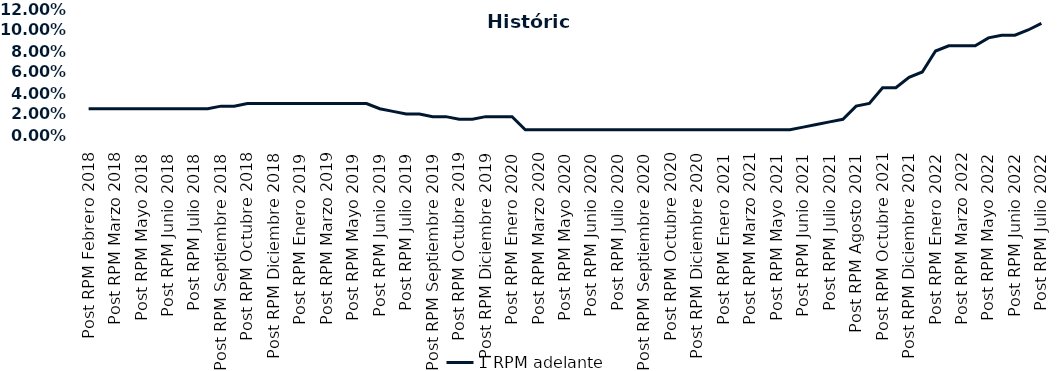
| Category | 1 RPM adelante |
|---|---|
| Post RPM Febrero 2018 | 0.025 |
| Pre RPM Marzo 2018 | 0.025 |
| Post RPM Marzo 2018 | 0.025 |
| Pre RPM Mayo 2018 | 0.025 |
| Post RPM Mayo 2018 | 0.025 |
| Pre RPM Junio 2018 | 0.025 |
| Post RPM Junio 2018 | 0.025 |
| Pre RPM Julio 2018 | 0.025 |
| Post RPM Julio 2018 | 0.025 |
| Pre RPM Septiembre 2018 | 0.025 |
| Post RPM Septiembre 2018 | 0.028 |
| Pre RPM Octubre 2018 | 0.028 |
| Post RPM Octubre 2018 | 0.03 |
| Pre RPM Diciembre 2018 | 0.03 |
| Post RPM Diciembre 2018 | 0.03 |
| Pre RPM Enero 2019 | 0.03 |
| Post RPM Enero 2019 | 0.03 |
| Pre RPM Marzo 2019 | 0.03 |
| Post RPM Marzo 2019 | 0.03 |
| Pre RPM Mayo 2019 | 0.03 |
| Post RPM Mayo 2019 | 0.03 |
| Pre RPM Junio 2019 | 0.03 |
| Post RPM Junio 2019 | 0.025 |
| Pre RPM Julio 2019 | 0.022 |
| Post RPM Julio 2019 | 0.02 |
| Pre RPM Septiembre 2019 | 0.02 |
| Post RPM Septiembre 2019 | 0.018 |
| Pre RPM Octubre 2019 | 0.018 |
| Post RPM Octubre 2019 | 0.015 |
| Pre RPM Diciembre 2019 | 0.015 |
| Post RPM Diciembre 2019 | 0.018 |
| Pre RPM Enero 2020 | 0.018 |
| Post RPM Enero 2020 | 0.018 |
| Pre RPM Marzo 2020 | 0.005 |
| Post RPM Marzo 2020 | 0.005 |
| Pre RPM Mayo 2020 | 0.005 |
| Post RPM Mayo 2020 | 0.005 |
| Pre RPM Junio 2020 | 0.005 |
| Post RPM Junio 2020 | 0.005 |
| Pre RPM Julio 2020 | 0.005 |
| Post RPM Julio 2020 | 0.005 |
| Pre RPM Septiembre 2020 | 0.005 |
| Post RPM Septiembre 2020 | 0.005 |
| Pre RPM Octubre 2020 | 0.005 |
| Post RPM Octubre 2020 | 0.005 |
| Pre RPM Diciembre 2020 | 0.005 |
| Post RPM Diciembre 2020 | 0.005 |
| Pre RPM Enero 2021 | 0.005 |
| Post RPM Enero 2021 | 0.005 |
| Pre RPM Marzo 2021 | 0.005 |
| Post RPM Marzo 2021 | 0.005 |
| Pre RPM Mayo 2021 | 0.005 |
| Post RPM Mayo 2021 | 0.005 |
| Pre RPM Junio 2021 | 0.005 |
| Post RPM Junio 2021 | 0.008 |
| Pre RPM Julio 2021 | 0.01 |
| Post RPM Julio 2021 | 0.012 |
| Pre RPM Agosto 2021 | 0.015 |
| Post RPM Agosto 2021 | 0.028 |
| Pre RPM Octubre 2021 | 0.03 |
| Post RPM Octubre 2021 | 0.045 |
| Pre RPM Diciembre 2021 | 0.045 |
| Post RPM Diciembre 2021 | 0.055 |
| Pre RPM Enero 2022 | 0.06 |
| Post RPM Enero 2022 | 0.08 |
| Pre RPM Marzo 2022 | 0.085 |
| Post RPM Marzo 2022 | 0.085 |
| Pre RPM Mayo 2022 | 0.085 |
| Post RPM Mayo 2022 | 0.092 |
| Pre RPM Junio 2022 | 0.095 |
| Post RPM Junio 2022 | 0.095 |
| Pre RPM Julio 2022 | 0.1 |
| Post RPM Julio 2022 | 0.106 |